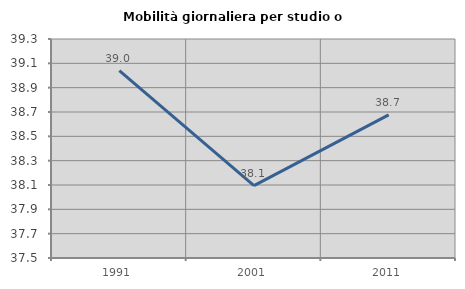
| Category | Mobilità giornaliera per studio o lavoro |
|---|---|
| 1991.0 | 39.04 |
| 2001.0 | 38.095 |
| 2011.0 | 38.676 |